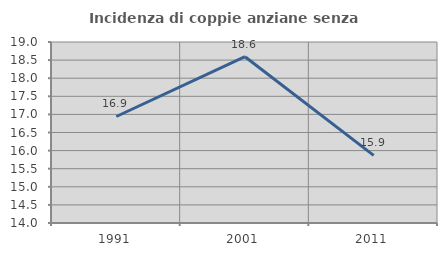
| Category | Incidenza di coppie anziane senza figli  |
|---|---|
| 1991.0 | 16.942 |
| 2001.0 | 18.594 |
| 2011.0 | 15.869 |